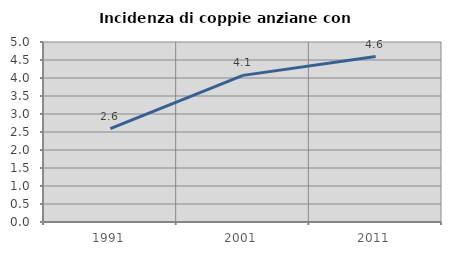
| Category | Incidenza di coppie anziane con figli |
|---|---|
| 1991.0 | 2.596 |
| 2001.0 | 4.073 |
| 2011.0 | 4.597 |